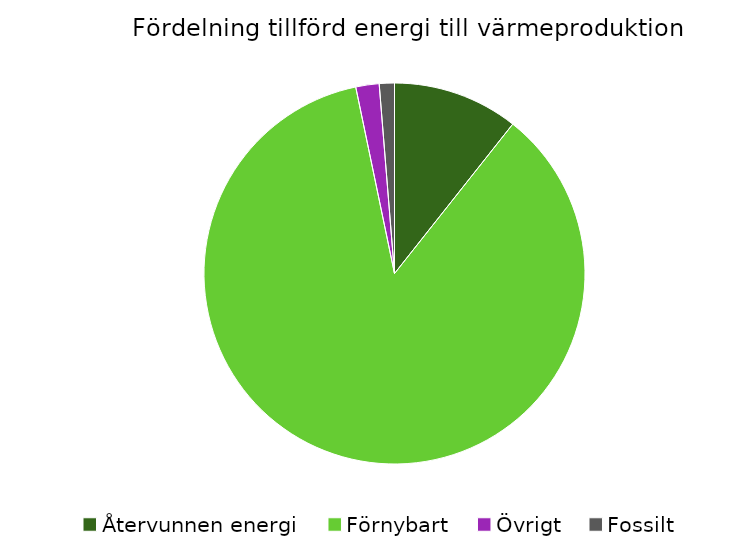
| Category | Fördelning värmeproduktion |
|---|---|
| Återvunnen energi | 0.107 |
| Förnybart | 0.861 |
| Övrigt | 0.02 |
| Fossilt | 0.013 |